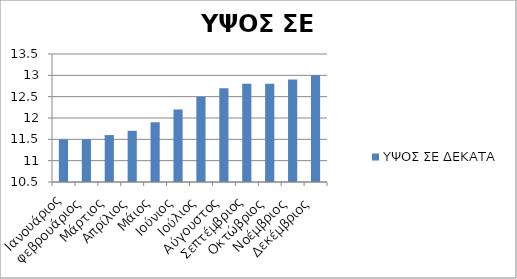
| Category | ΥΨΟΣ ΣΕ ΔΕΚΑΤΑ |
|---|---|
| Ιανουάριος | 11.5 |
| φεβρουάριος | 11.5 |
| Μάρτιος | 11.6 |
| Απρίλιος | 11.7 |
| Μάιος | 11.9 |
| Ιούνιος | 12.2 |
| Ιούλιος | 12.5 |
| Αύγουστος | 12.7 |
| Σεπτέμβριος | 12.8 |
| Οκτώβριος | 12.8 |
| Νοέμβριος | 12.9 |
| Δεκέμβριος | 13 |